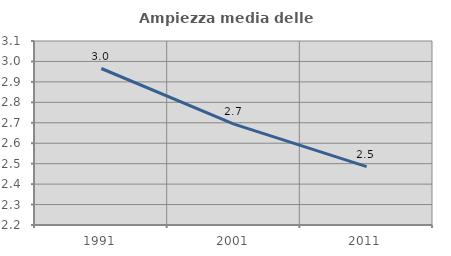
| Category | Ampiezza media delle famiglie |
|---|---|
| 1991.0 | 2.965 |
| 2001.0 | 2.693 |
| 2011.0 | 2.486 |